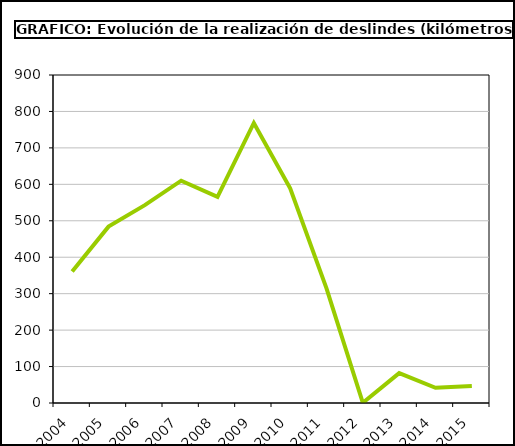
| Category | costal |
|---|---|
| 2004.0 | 360.999 |
| 2005.0 | 483.946 |
| 2006.0 | 542.899 |
| 2007.0 | 609.979 |
| 2008.0 | 565.426 |
| 2009.0 | 768.343 |
| 2010.0 | 588.854 |
| 2011.0 | 314.421 |
| 2012.0 | 0.6 |
| 2013.0 | 81.928 |
| 2014.0 | 41.8 |
| 2015.0 | 46.663 |